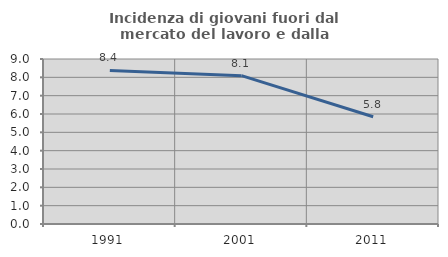
| Category | Incidenza di giovani fuori dal mercato del lavoro e dalla formazione  |
|---|---|
| 1991.0 | 8.374 |
| 2001.0 | 8.092 |
| 2011.0 | 5.848 |